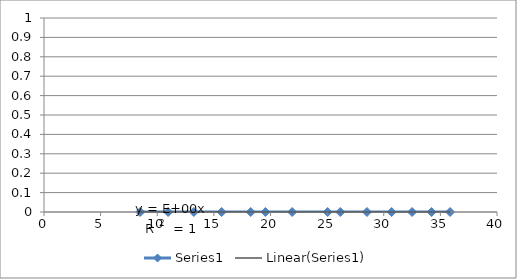
| Category | Series 0 |
|---|---|
| 8.490070671083958 | 0 |
| 10.958161342123049 | 0 |
| 13.233272459977538 | 0 |
| 15.68937857277974 | 0 |
| 18.253454467579555 | 0 |
| 19.549235279161177 | 0 |
| 21.91476671105581 | 0 |
| 25.046464820409284 | 0 |
| 26.160024847083 | 0 |
| 28.519984221594513 | 0 |
| 30.6990569887741 | 0 |
| 32.503461354138885 | 0 |
| 34.22721139678195 | 0 |
| 35.85449483677046 | 0 |